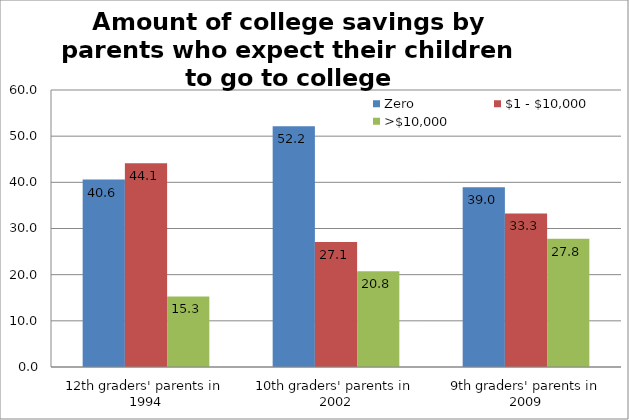
| Category | Zero | $1 - $10,000 | >$10,000 |
|---|---|---|---|
| 12th graders' parents in 1994 | 40.601 | 44.12 | 15.279 |
| 10th graders' parents in 2002 | 52.163 | 27.079 | 20.758 |
| 9th graders' parents in 2009 | 38.959 | 33.261 | 27.78 |